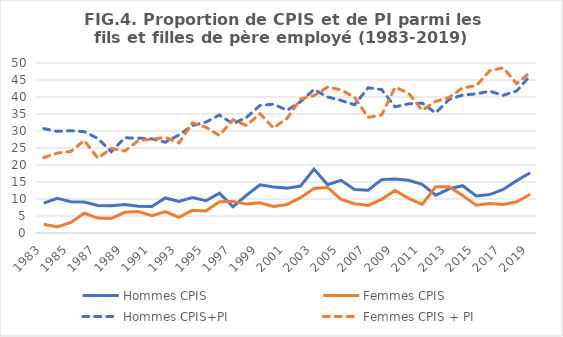
| Category | Hommes CPIS | Femmes CPIS | Hommes CPIS+PI | Femmes CPIS + PI |
|---|---|---|---|---|
| 1983.0 | 8.8 | 2.6 | 30.7 | 22.2 |
| 1984.0 | 10.2 | 1.8 | 29.9 | 23.5 |
| 1985.0 | 9.2 | 3.1 | 30.1 | 24 |
| 1986.0 | 9.1 | 5.8 | 29.8 | 27.2 |
| 1987.0 | 8.1 | 4.4 | 27.8 | 22 |
| 1988.0 | 8 | 4.3 | 23.9 | 24.9 |
| 1989.0 | 8.4 | 6.1 | 28 | 24.1 |
| 1990.0 | 7.9 | 6.3 | 27.9 | 27.2 |
| 1991.0 | 7.8 | 5.1 | 27.7 | 27.6 |
| 1992.0 | 10.3 | 6.3 | 26.7 | 28.1 |
| 1993.0 | 9.3 | 4.6 | 28.8 | 26.5 |
| 1994.0 | 10.4 | 6.7 | 31.6 | 32.4 |
| 1995.0 | 9.5 | 6.5 | 32.6 | 31.1 |
| 1996.0 | 11.7 | 9.2 | 34.7 | 28.7 |
| 1997.0 | 7.7 | 9.3 | 32.1 | 33.3 |
| 1998.0 | 11.1 | 8.5 | 34 | 31.6 |
| 1999.0 | 14.2 | 8.9 | 37.5 | 35.1 |
| 2000.0 | 13.5 | 7.8 | 37.9 | 30.9 |
| 2001.0 | 13.2 | 8.4 | 36.1 | 33.7 |
| 2002.0 | 13.8 | 10.4 | 38.6 | 39.4 |
| 2003.0 | 18.8 | 13.1 | 42.2 | 40.4 |
| 2004.0 | 14.2 | 13.4 | 40 | 42.9 |
| 2005.0 | 15.5 | 9.9 | 39 | 42.1 |
| 2006.0 | 12.8 | 8.6 | 37.7 | 39.9 |
| 2007.0 | 12.6 | 8.1 | 42.7 | 34 |
| 2008.0 | 15.7 | 9.9 | 42.2 | 34.7 |
| 2009.0 | 15.9 | 12.5 | 37.1 | 42.9 |
| 2010.0 | 15.5 | 10.2 | 38 | 41.1 |
| 2011.0 | 14.3 | 8.4 | 38.2 | 36.1 |
| 2012.0 | 11.1 | 13.6 | 35.3 | 38.7 |
| 2013.0 | 13 | 13.6 | 39.3 | 39.9 |
| 2014.0 | 13.9 | 11 | 40.6 | 42.7 |
| 2015.0 | 10.9 | 8.2 | 40.9 | 43.3 |
| 2016.0 | 11.3 | 8.7 | 41.7 | 47.7 |
| 2017.0 | 12.8 | 8.4 | 40.5 | 48.6 |
| 2018.0 | 15.4 | 9.2 | 41.8 | 43.9 |
| 2019.0 | 17.7 | 11.4 | 46.3 | 47.3 |